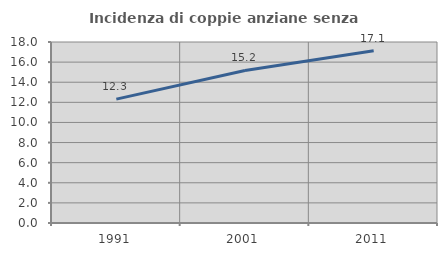
| Category | Incidenza di coppie anziane senza figli  |
|---|---|
| 1991.0 | 12.319 |
| 2001.0 | 15.172 |
| 2011.0 | 17.123 |